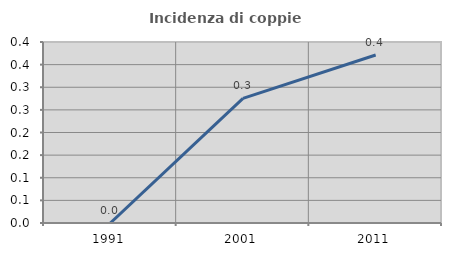
| Category | Incidenza di coppie miste |
|---|---|
| 1991.0 | 0 |
| 2001.0 | 0.275 |
| 2011.0 | 0.371 |